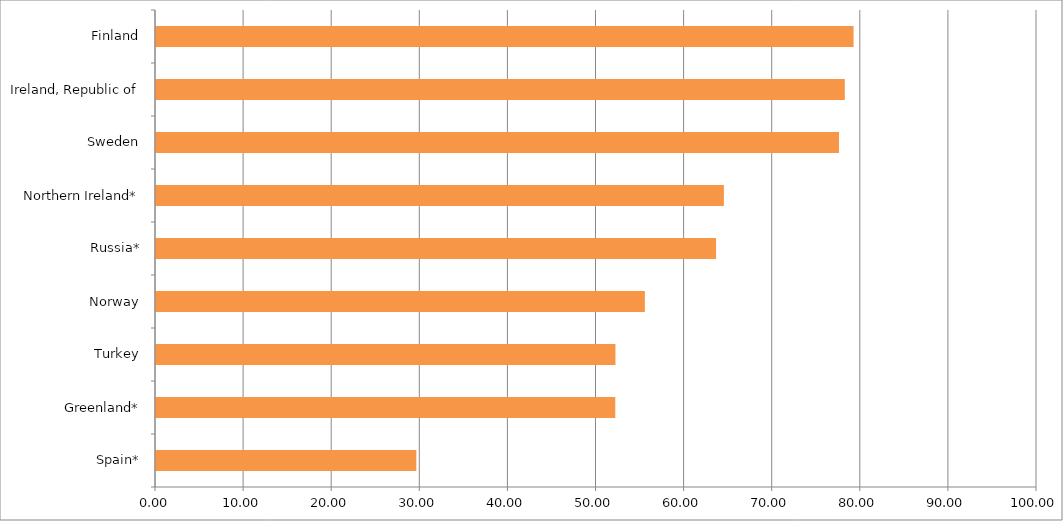
| Category | Score |
|---|---|
| Spain* | 29.55 |
| Greenland* | 52.133 |
| Turkey | 52.152 |
| Norway | 55.49 |
| Russia* | 63.573 |
| Northern Ireland* | 64.461 |
| Sweden | 77.524 |
| Ireland, Republic of | 78.182 |
| Finland | 79.179 |